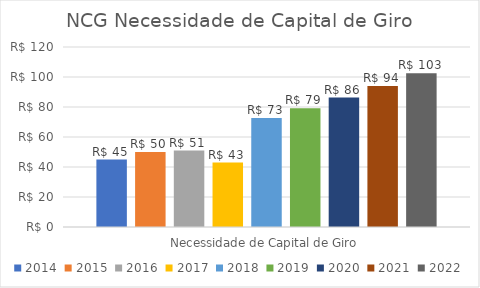
| Category | 2014 | 2015 | 2016 | 2017 | 2018 | 2019 | 2020 | 2021 | 2022 |
|---|---|---|---|---|---|---|---|---|---|
| Necessidade de Capital de Giro | 45 | 50 | 51 | 43 | 72.621 | 79.156 | 86.281 | 94.046 | 102.51 |